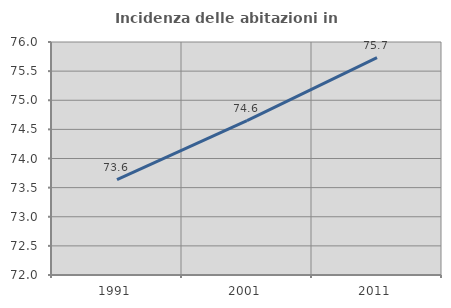
| Category | Incidenza delle abitazioni in proprietà  |
|---|---|
| 1991.0 | 73.636 |
| 2001.0 | 74.649 |
| 2011.0 | 75.732 |